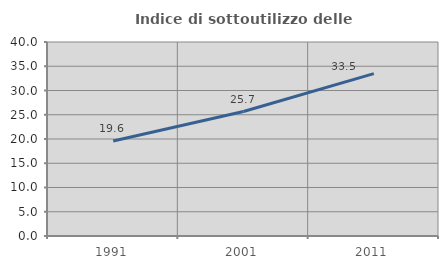
| Category | Indice di sottoutilizzo delle abitazioni  |
|---|---|
| 1991.0 | 19.588 |
| 2001.0 | 25.658 |
| 2011.0 | 33.468 |